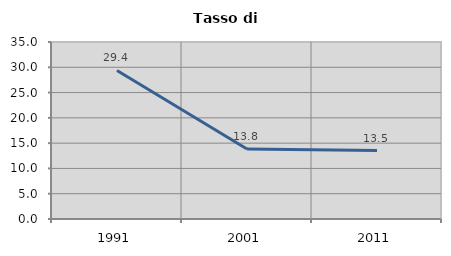
| Category | Tasso di disoccupazione   |
|---|---|
| 1991.0 | 29.375 |
| 2001.0 | 13.836 |
| 2011.0 | 13.523 |